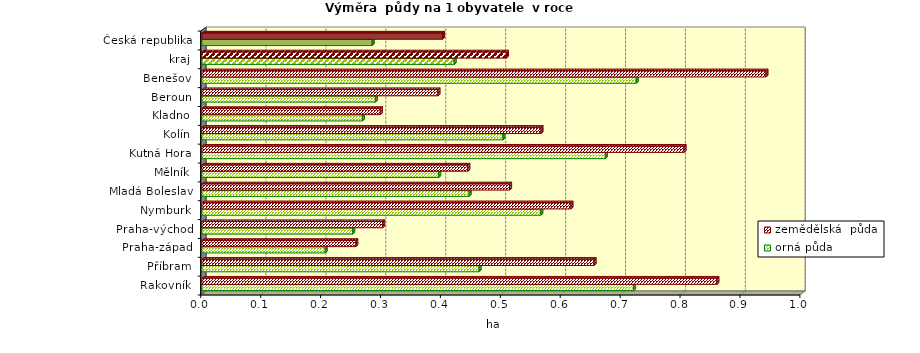
| Category | orná půda | zemědělská  půda |
|---|---|---|
| Rakovník | 0.72 | 0.859 |
| Příbram | 0.463 | 0.654 |
| Praha-západ | 0.206 | 0.257 |
| Praha-východ | 0.252 | 0.302 |
| Nymburk | 0.566 | 0.616 |
| Mladá Boleslav | 0.446 | 0.513 |
| Mělník | 0.395 | 0.444 |
| Kutná Hora | 0.673 | 0.805 |
| Kolín | 0.502 | 0.566 |
| Kladno | 0.268 | 0.298 |
| Beroun | 0.29 | 0.394 |
| Benešov | 0.725 | 0.941 |
| kraj | 0.421 | 0.508 |
| Česká republika | 0.284 | 0.401 |